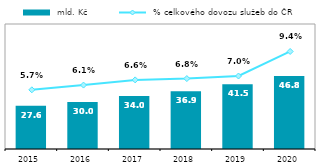
| Category |  mld. Kč |
|---|---|
| 2015.0 | 27.615 |
| 2016.0 | 30.003 |
| 2017.0 | 33.956 |
| 2018.0 | 36.888 |
| 2019.0 | 41.504 |
| 2020.0 | 46.796 |